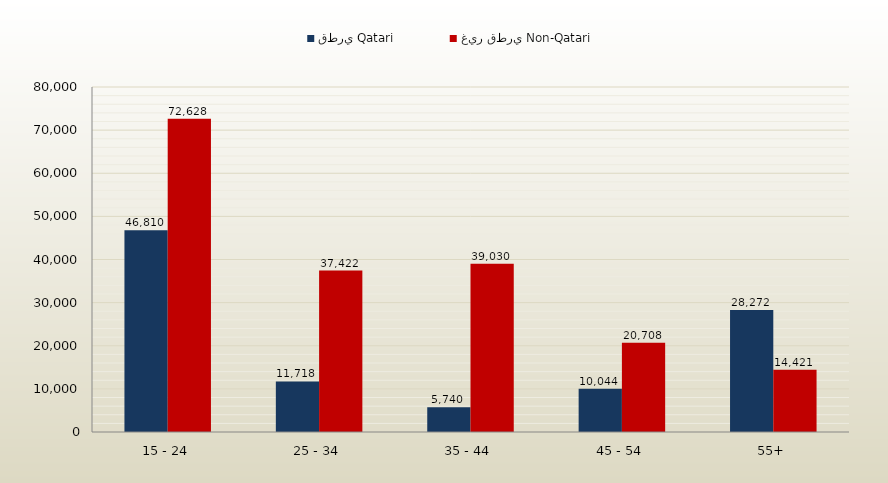
| Category | قطري Qatari | غير قطري Non-Qatari |
|---|---|---|
| 15 - 24 | 46810 | 72628 |
| 25 - 34 | 11718 | 37422 |
| 35 - 44 | 5740 | 39030 |
| 45 - 54 | 10044 | 20708 |
| 55+ | 28272 | 14421 |